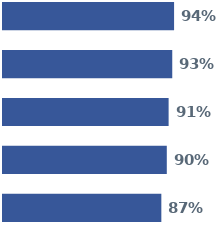
| Category | Series 0 | Series 1 | Series 2 | Series 3 | Series 4 |
|---|---|---|---|---|---|
| 0 | 0.94 | 0.93 | 0.91 | 0.9 | 0.87 |